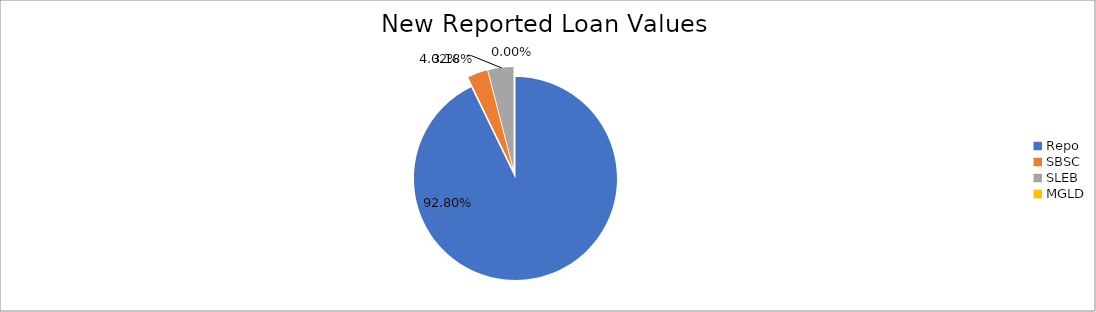
| Category | Series 0 |
|---|---|
| Repo | 8933164.006 |
| SBSC | 305941.645 |
| SLEB | 386542.263 |
| MGLD | 148.222 |